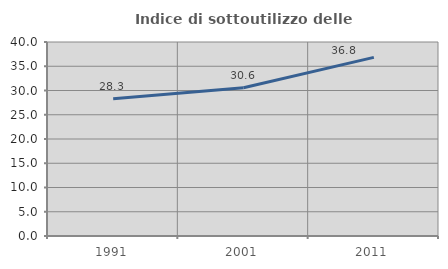
| Category | Indice di sottoutilizzo delle abitazioni  |
|---|---|
| 1991.0 | 28.284 |
| 2001.0 | 30.553 |
| 2011.0 | 36.825 |